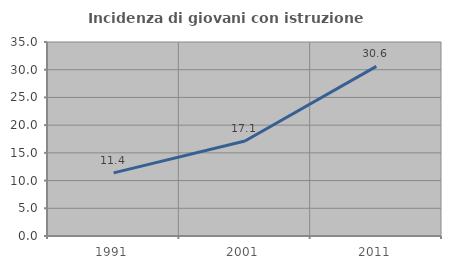
| Category | Incidenza di giovani con istruzione universitaria |
|---|---|
| 1991.0 | 11.388 |
| 2001.0 | 17.143 |
| 2011.0 | 30.594 |